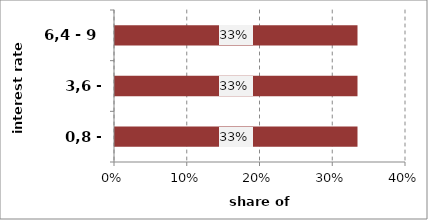
| Category | Series 0 |
|---|---|
| 0,8 - 3,5 | 0.333 |
| 3,6 - 6,3 | 0.333 |
| 6,4 - 9 | 0.333 |